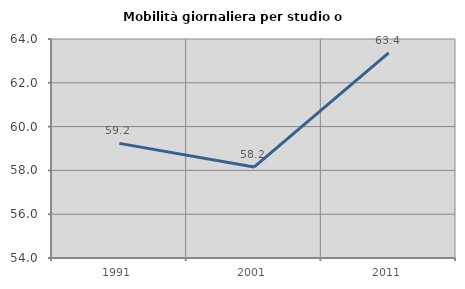
| Category | Mobilità giornaliera per studio o lavoro |
|---|---|
| 1991.0 | 59.233 |
| 2001.0 | 58.152 |
| 2011.0 | 63.37 |